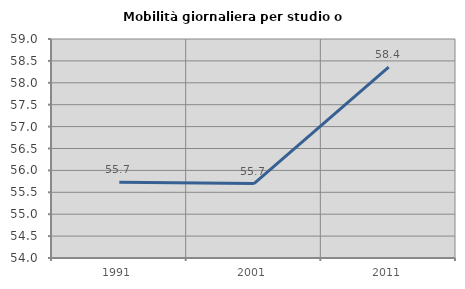
| Category | Mobilità giornaliera per studio o lavoro |
|---|---|
| 1991.0 | 55.727 |
| 2001.0 | 55.7 |
| 2011.0 | 58.36 |